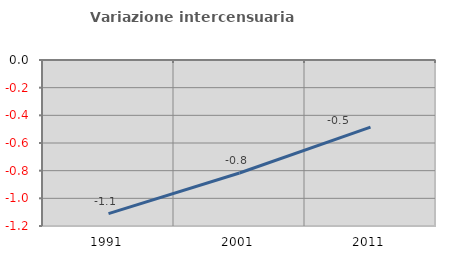
| Category | Variazione intercensuaria annua |
|---|---|
| 1991.0 | -1.111 |
| 2001.0 | -0.817 |
| 2011.0 | -0.486 |